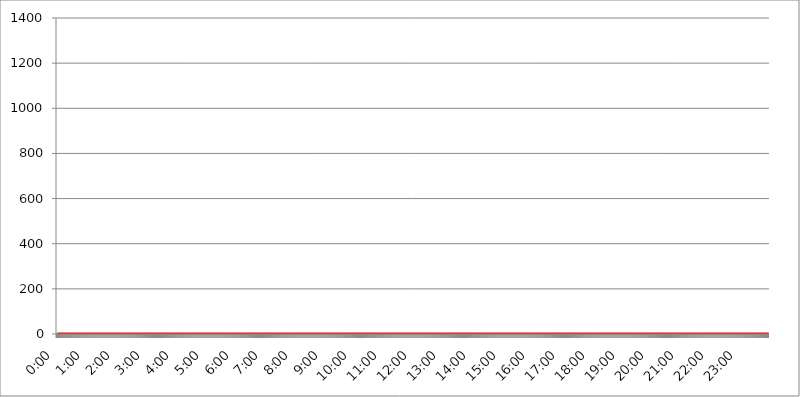
| Category | 2018.04.14. Intenzitás [W/m^2] |
|---|---|
| 0.0 | 0 |
| 0.0006944444444444445 | 0 |
| 0.001388888888888889 | 0 |
| 0.0020833333333333333 | 0 |
| 0.002777777777777778 | 0 |
| 0.003472222222222222 | 0 |
| 0.004166666666666667 | 0 |
| 0.004861111111111111 | 0 |
| 0.005555555555555556 | 0 |
| 0.0062499999999999995 | 0 |
| 0.006944444444444444 | 0 |
| 0.007638888888888889 | 0 |
| 0.008333333333333333 | 0 |
| 0.009027777777777779 | 0 |
| 0.009722222222222222 | 0 |
| 0.010416666666666666 | 0 |
| 0.011111111111111112 | 0 |
| 0.011805555555555555 | 0 |
| 0.012499999999999999 | 0 |
| 0.013194444444444444 | 0 |
| 0.013888888888888888 | 0 |
| 0.014583333333333332 | 0 |
| 0.015277777777777777 | 0 |
| 0.015972222222222224 | 0 |
| 0.016666666666666666 | 0 |
| 0.017361111111111112 | 0 |
| 0.018055555555555557 | 0 |
| 0.01875 | 0 |
| 0.019444444444444445 | 0 |
| 0.02013888888888889 | 0 |
| 0.020833333333333332 | 0 |
| 0.02152777777777778 | 0 |
| 0.022222222222222223 | 0 |
| 0.02291666666666667 | 0 |
| 0.02361111111111111 | 0 |
| 0.024305555555555556 | 0 |
| 0.024999999999999998 | 0 |
| 0.025694444444444447 | 0 |
| 0.02638888888888889 | 0 |
| 0.027083333333333334 | 0 |
| 0.027777777777777776 | 0 |
| 0.02847222222222222 | 0 |
| 0.029166666666666664 | 0 |
| 0.029861111111111113 | 0 |
| 0.030555555555555555 | 0 |
| 0.03125 | 0 |
| 0.03194444444444445 | 0 |
| 0.03263888888888889 | 0 |
| 0.03333333333333333 | 0 |
| 0.034027777777777775 | 0 |
| 0.034722222222222224 | 0 |
| 0.035416666666666666 | 0 |
| 0.036111111111111115 | 0 |
| 0.03680555555555556 | 0 |
| 0.0375 | 0 |
| 0.03819444444444444 | 0 |
| 0.03888888888888889 | 0 |
| 0.03958333333333333 | 0 |
| 0.04027777777777778 | 0 |
| 0.04097222222222222 | 0 |
| 0.041666666666666664 | 0 |
| 0.042361111111111106 | 0 |
| 0.04305555555555556 | 0 |
| 0.043750000000000004 | 0 |
| 0.044444444444444446 | 0 |
| 0.04513888888888889 | 0 |
| 0.04583333333333334 | 0 |
| 0.04652777777777778 | 0 |
| 0.04722222222222222 | 0 |
| 0.04791666666666666 | 0 |
| 0.04861111111111111 | 0 |
| 0.049305555555555554 | 0 |
| 0.049999999999999996 | 0 |
| 0.05069444444444445 | 0 |
| 0.051388888888888894 | 0 |
| 0.052083333333333336 | 0 |
| 0.05277777777777778 | 0 |
| 0.05347222222222222 | 0 |
| 0.05416666666666667 | 0 |
| 0.05486111111111111 | 0 |
| 0.05555555555555555 | 0 |
| 0.05625 | 0 |
| 0.05694444444444444 | 0 |
| 0.057638888888888885 | 0 |
| 0.05833333333333333 | 0 |
| 0.05902777777777778 | 0 |
| 0.059722222222222225 | 0 |
| 0.06041666666666667 | 0 |
| 0.061111111111111116 | 0 |
| 0.06180555555555556 | 0 |
| 0.0625 | 0 |
| 0.06319444444444444 | 0 |
| 0.06388888888888888 | 0 |
| 0.06458333333333334 | 0 |
| 0.06527777777777778 | 0 |
| 0.06597222222222222 | 0 |
| 0.06666666666666667 | 0 |
| 0.06736111111111111 | 0 |
| 0.06805555555555555 | 0 |
| 0.06874999999999999 | 0 |
| 0.06944444444444443 | 0 |
| 0.07013888888888889 | 0 |
| 0.07083333333333333 | 0 |
| 0.07152777777777779 | 0 |
| 0.07222222222222223 | 0 |
| 0.07291666666666667 | 0 |
| 0.07361111111111111 | 0 |
| 0.07430555555555556 | 0 |
| 0.075 | 0 |
| 0.07569444444444444 | 0 |
| 0.0763888888888889 | 0 |
| 0.07708333333333334 | 0 |
| 0.07777777777777778 | 0 |
| 0.07847222222222222 | 0 |
| 0.07916666666666666 | 0 |
| 0.0798611111111111 | 0 |
| 0.08055555555555556 | 0 |
| 0.08125 | 0 |
| 0.08194444444444444 | 0 |
| 0.08263888888888889 | 0 |
| 0.08333333333333333 | 0 |
| 0.08402777777777777 | 0 |
| 0.08472222222222221 | 0 |
| 0.08541666666666665 | 0 |
| 0.08611111111111112 | 0 |
| 0.08680555555555557 | 0 |
| 0.08750000000000001 | 0 |
| 0.08819444444444445 | 0 |
| 0.08888888888888889 | 0 |
| 0.08958333333333333 | 0 |
| 0.09027777777777778 | 0 |
| 0.09097222222222222 | 0 |
| 0.09166666666666667 | 0 |
| 0.09236111111111112 | 0 |
| 0.09305555555555556 | 0 |
| 0.09375 | 0 |
| 0.09444444444444444 | 0 |
| 0.09513888888888888 | 0 |
| 0.09583333333333333 | 0 |
| 0.09652777777777777 | 0 |
| 0.09722222222222222 | 0 |
| 0.09791666666666667 | 0 |
| 0.09861111111111111 | 0 |
| 0.09930555555555555 | 0 |
| 0.09999999999999999 | 0 |
| 0.10069444444444443 | 0 |
| 0.1013888888888889 | 0 |
| 0.10208333333333335 | 0 |
| 0.10277777777777779 | 0 |
| 0.10347222222222223 | 0 |
| 0.10416666666666667 | 0 |
| 0.10486111111111111 | 0 |
| 0.10555555555555556 | 0 |
| 0.10625 | 0 |
| 0.10694444444444444 | 0 |
| 0.1076388888888889 | 0 |
| 0.10833333333333334 | 0 |
| 0.10902777777777778 | 0 |
| 0.10972222222222222 | 0 |
| 0.1111111111111111 | 0 |
| 0.11180555555555556 | 0 |
| 0.11180555555555556 | 0 |
| 0.1125 | 0 |
| 0.11319444444444444 | 0 |
| 0.11388888888888889 | 0 |
| 0.11458333333333333 | 0 |
| 0.11527777777777777 | 0 |
| 0.11597222222222221 | 0 |
| 0.11666666666666665 | 0 |
| 0.1173611111111111 | 0 |
| 0.11805555555555557 | 0 |
| 0.11944444444444445 | 0 |
| 0.12013888888888889 | 0 |
| 0.12083333333333333 | 0 |
| 0.12152777777777778 | 0 |
| 0.12222222222222223 | 0 |
| 0.12291666666666667 | 0 |
| 0.12291666666666667 | 0 |
| 0.12361111111111112 | 0 |
| 0.12430555555555556 | 0 |
| 0.125 | 0 |
| 0.12569444444444444 | 0 |
| 0.12638888888888888 | 0 |
| 0.12708333333333333 | 0 |
| 0.16875 | 0 |
| 0.12847222222222224 | 0 |
| 0.12916666666666668 | 0 |
| 0.12986111111111112 | 0 |
| 0.13055555555555556 | 0 |
| 0.13125 | 0 |
| 0.13194444444444445 | 0 |
| 0.1326388888888889 | 0 |
| 0.13333333333333333 | 0 |
| 0.13402777777777777 | 0 |
| 0.13402777777777777 | 0 |
| 0.13472222222222222 | 0 |
| 0.13541666666666666 | 0 |
| 0.1361111111111111 | 0 |
| 0.13749999999999998 | 0 |
| 0.13819444444444443 | 0 |
| 0.1388888888888889 | 0 |
| 0.13958333333333334 | 0 |
| 0.14027777777777778 | 0 |
| 0.14097222222222222 | 0 |
| 0.14166666666666666 | 0 |
| 0.1423611111111111 | 0 |
| 0.14305555555555557 | 0 |
| 0.14375000000000002 | 0 |
| 0.14444444444444446 | 0 |
| 0.1451388888888889 | 0 |
| 0.1451388888888889 | 0 |
| 0.14652777777777778 | 0 |
| 0.14722222222222223 | 0 |
| 0.14791666666666667 | 0 |
| 0.1486111111111111 | 0 |
| 0.14930555555555555 | 0 |
| 0.15 | 0 |
| 0.15069444444444444 | 0 |
| 0.15138888888888888 | 0 |
| 0.15208333333333332 | 0 |
| 0.15277777777777776 | 0 |
| 0.15347222222222223 | 0 |
| 0.15416666666666667 | 0 |
| 0.15486111111111112 | 0 |
| 0.15555555555555556 | 0 |
| 0.15625 | 0 |
| 0.15694444444444444 | 0 |
| 0.15763888888888888 | 0 |
| 0.15833333333333333 | 0 |
| 0.15902777777777777 | 0 |
| 0.15972222222222224 | 0 |
| 0.16041666666666668 | 0 |
| 0.16111111111111112 | 0 |
| 0.16180555555555556 | 0 |
| 0.1625 | 0 |
| 0.16319444444444445 | 0 |
| 0.1638888888888889 | 0 |
| 0.16458333333333333 | 0 |
| 0.16527777777777777 | 0 |
| 0.16597222222222222 | 0 |
| 0.16666666666666666 | 0 |
| 0.1673611111111111 | 0 |
| 0.16805555555555554 | 0 |
| 0.16874999999999998 | 0 |
| 0.16944444444444443 | 0 |
| 0.17013888888888887 | 0 |
| 0.1708333333333333 | 0 |
| 0.17152777777777775 | 0 |
| 0.17222222222222225 | 0 |
| 0.1729166666666667 | 0 |
| 0.17361111111111113 | 0 |
| 0.17430555555555557 | 0 |
| 0.17500000000000002 | 0 |
| 0.17569444444444446 | 0 |
| 0.1763888888888889 | 0 |
| 0.17708333333333334 | 0 |
| 0.17777777777777778 | 0 |
| 0.17847222222222223 | 0 |
| 0.17916666666666667 | 0 |
| 0.1798611111111111 | 0 |
| 0.18055555555555555 | 0 |
| 0.18125 | 0 |
| 0.18194444444444444 | 0 |
| 0.1826388888888889 | 0 |
| 0.18333333333333335 | 0 |
| 0.1840277777777778 | 0 |
| 0.18472222222222223 | 0 |
| 0.18541666666666667 | 0 |
| 0.18611111111111112 | 0 |
| 0.18680555555555556 | 0 |
| 0.1875 | 0 |
| 0.18819444444444444 | 0 |
| 0.18888888888888888 | 0 |
| 0.18958333333333333 | 0 |
| 0.19027777777777777 | 0 |
| 0.1909722222222222 | 0 |
| 0.19166666666666665 | 0 |
| 0.19236111111111112 | 0 |
| 0.19305555555555554 | 0 |
| 0.19375 | 0 |
| 0.19444444444444445 | 0 |
| 0.1951388888888889 | 0 |
| 0.19583333333333333 | 0 |
| 0.19652777777777777 | 0 |
| 0.19722222222222222 | 0 |
| 0.19791666666666666 | 0 |
| 0.1986111111111111 | 0 |
| 0.19930555555555554 | 0 |
| 0.19999999999999998 | 0 |
| 0.20069444444444443 | 0 |
| 0.20138888888888887 | 0 |
| 0.2020833333333333 | 0 |
| 0.2027777777777778 | 0 |
| 0.2034722222222222 | 0 |
| 0.2041666666666667 | 0 |
| 0.20486111111111113 | 0 |
| 0.20555555555555557 | 0 |
| 0.20625000000000002 | 0 |
| 0.20694444444444446 | 0 |
| 0.2076388888888889 | 0 |
| 0.20833333333333334 | 0 |
| 0.20902777777777778 | 0 |
| 0.20972222222222223 | 0 |
| 0.21041666666666667 | 0 |
| 0.2111111111111111 | 0 |
| 0.21180555555555555 | 0 |
| 0.2125 | 0 |
| 0.21319444444444444 | 0 |
| 0.2138888888888889 | 0 |
| 0.21458333333333335 | 0 |
| 0.2152777777777778 | 0 |
| 0.21597222222222223 | 0 |
| 0.21666666666666667 | 0 |
| 0.21736111111111112 | 0 |
| 0.21805555555555556 | 0 |
| 0.21875 | 0 |
| 0.21944444444444444 | 0 |
| 0.22013888888888888 | 0 |
| 0.22083333333333333 | 0 |
| 0.22152777777777777 | 0 |
| 0.2222222222222222 | 0 |
| 0.22291666666666665 | 0 |
| 0.2236111111111111 | 0 |
| 0.22430555555555556 | 0 |
| 0.225 | 0 |
| 0.22569444444444445 | 0 |
| 0.2263888888888889 | 0 |
| 0.22708333333333333 | 0 |
| 0.22777777777777777 | 0 |
| 0.22847222222222222 | 0 |
| 0.22916666666666666 | 0 |
| 0.2298611111111111 | 0 |
| 0.23055555555555554 | 0 |
| 0.23124999999999998 | 0 |
| 0.23194444444444443 | 0 |
| 0.23263888888888887 | 0 |
| 0.2333333333333333 | 0 |
| 0.2340277777777778 | 0 |
| 0.2347222222222222 | 0 |
| 0.2354166666666667 | 0 |
| 0.23611111111111113 | 0 |
| 0.23680555555555557 | 0 |
| 0.23750000000000002 | 0 |
| 0.23819444444444446 | 0 |
| 0.2388888888888889 | 0 |
| 0.23958333333333334 | 0 |
| 0.24027777777777778 | 0 |
| 0.24097222222222223 | 0 |
| 0.24166666666666667 | 0 |
| 0.2423611111111111 | 0 |
| 0.24305555555555555 | 0 |
| 0.24375 | 0 |
| 0.24444444444444446 | 0 |
| 0.24513888888888888 | 0 |
| 0.24583333333333335 | 0 |
| 0.2465277777777778 | 0 |
| 0.24722222222222223 | 0 |
| 0.24791666666666667 | 0 |
| 0.24861111111111112 | 0 |
| 0.24930555555555556 | 0 |
| 0.25 | 0 |
| 0.25069444444444444 | 0 |
| 0.2513888888888889 | 0 |
| 0.2520833333333333 | 0 |
| 0.25277777777777777 | 0 |
| 0.2534722222222222 | 0 |
| 0.25416666666666665 | 0 |
| 0.2548611111111111 | 0 |
| 0.2555555555555556 | 0 |
| 0.25625000000000003 | 0 |
| 0.2569444444444445 | 0 |
| 0.2576388888888889 | 0 |
| 0.25833333333333336 | 0 |
| 0.2590277777777778 | 0 |
| 0.25972222222222224 | 0 |
| 0.2604166666666667 | 0 |
| 0.2611111111111111 | 0 |
| 0.26180555555555557 | 0 |
| 0.2625 | 0 |
| 0.26319444444444445 | 0 |
| 0.2638888888888889 | 0 |
| 0.26458333333333334 | 0 |
| 0.2652777777777778 | 0 |
| 0.2659722222222222 | 0 |
| 0.26666666666666666 | 0 |
| 0.2673611111111111 | 0 |
| 0.26805555555555555 | 0 |
| 0.26875 | 0 |
| 0.26944444444444443 | 0 |
| 0.2701388888888889 | 0 |
| 0.2708333333333333 | 0 |
| 0.27152777777777776 | 0 |
| 0.2722222222222222 | 0 |
| 0.27291666666666664 | 0 |
| 0.2736111111111111 | 0 |
| 0.2743055555555555 | 0 |
| 0.27499999999999997 | 0 |
| 0.27569444444444446 | 0 |
| 0.27638888888888885 | 0 |
| 0.27708333333333335 | 0 |
| 0.2777777777777778 | 0 |
| 0.27847222222222223 | 0 |
| 0.2791666666666667 | 0 |
| 0.2798611111111111 | 0 |
| 0.28055555555555556 | 0 |
| 0.28125 | 0 |
| 0.28194444444444444 | 0 |
| 0.2826388888888889 | 0 |
| 0.2833333333333333 | 0 |
| 0.28402777777777777 | 0 |
| 0.2847222222222222 | 0 |
| 0.28541666666666665 | 0 |
| 0.28611111111111115 | 0 |
| 0.28680555555555554 | 0 |
| 0.28750000000000003 | 0 |
| 0.2881944444444445 | 0 |
| 0.2888888888888889 | 0 |
| 0.28958333333333336 | 0 |
| 0.2902777777777778 | 0 |
| 0.29097222222222224 | 0 |
| 0.2916666666666667 | 0 |
| 0.2923611111111111 | 0 |
| 0.29305555555555557 | 0 |
| 0.29375 | 0 |
| 0.29444444444444445 | 0 |
| 0.2951388888888889 | 0 |
| 0.29583333333333334 | 0 |
| 0.2965277777777778 | 0 |
| 0.2972222222222222 | 0 |
| 0.29791666666666666 | 0 |
| 0.2986111111111111 | 0 |
| 0.29930555555555555 | 0 |
| 0.3 | 0 |
| 0.30069444444444443 | 0 |
| 0.3013888888888889 | 0 |
| 0.3020833333333333 | 0 |
| 0.30277777777777776 | 0 |
| 0.3034722222222222 | 0 |
| 0.30416666666666664 | 0 |
| 0.3048611111111111 | 0 |
| 0.3055555555555555 | 0 |
| 0.30624999999999997 | 0 |
| 0.3069444444444444 | 0 |
| 0.3076388888888889 | 0 |
| 0.30833333333333335 | 0 |
| 0.3090277777777778 | 0 |
| 0.30972222222222223 | 0 |
| 0.3104166666666667 | 0 |
| 0.3111111111111111 | 0 |
| 0.31180555555555556 | 0 |
| 0.3125 | 0 |
| 0.31319444444444444 | 0 |
| 0.3138888888888889 | 0 |
| 0.3145833333333333 | 0 |
| 0.31527777777777777 | 0 |
| 0.3159722222222222 | 0 |
| 0.31666666666666665 | 0 |
| 0.31736111111111115 | 0 |
| 0.31805555555555554 | 0 |
| 0.31875000000000003 | 0 |
| 0.3194444444444445 | 0 |
| 0.3201388888888889 | 0 |
| 0.32083333333333336 | 0 |
| 0.3215277777777778 | 0 |
| 0.32222222222222224 | 0 |
| 0.3229166666666667 | 0 |
| 0.3236111111111111 | 0 |
| 0.32430555555555557 | 0 |
| 0.325 | 0 |
| 0.32569444444444445 | 0 |
| 0.3263888888888889 | 0 |
| 0.32708333333333334 | 0 |
| 0.3277777777777778 | 0 |
| 0.3284722222222222 | 0 |
| 0.32916666666666666 | 0 |
| 0.3298611111111111 | 0 |
| 0.33055555555555555 | 0 |
| 0.33125 | 0 |
| 0.33194444444444443 | 0 |
| 0.3326388888888889 | 0 |
| 0.3333333333333333 | 0 |
| 0.3340277777777778 | 0 |
| 0.3347222222222222 | 0 |
| 0.3354166666666667 | 0 |
| 0.3361111111111111 | 0 |
| 0.3368055555555556 | 0 |
| 0.33749999999999997 | 0 |
| 0.33819444444444446 | 0 |
| 0.33888888888888885 | 0 |
| 0.33958333333333335 | 0 |
| 0.34027777777777773 | 0 |
| 0.34097222222222223 | 0 |
| 0.3416666666666666 | 0 |
| 0.3423611111111111 | 0 |
| 0.3430555555555555 | 0 |
| 0.34375 | 0 |
| 0.3444444444444445 | 0 |
| 0.3451388888888889 | 0 |
| 0.3458333333333334 | 0 |
| 0.34652777777777777 | 0 |
| 0.34722222222222227 | 0 |
| 0.34791666666666665 | 0 |
| 0.34861111111111115 | 0 |
| 0.34930555555555554 | 0 |
| 0.35000000000000003 | 0 |
| 0.3506944444444444 | 0 |
| 0.3513888888888889 | 0 |
| 0.3520833333333333 | 0 |
| 0.3527777777777778 | 0 |
| 0.3534722222222222 | 0 |
| 0.3541666666666667 | 0 |
| 0.3548611111111111 | 0 |
| 0.35555555555555557 | 0 |
| 0.35625 | 0 |
| 0.35694444444444445 | 0 |
| 0.3576388888888889 | 0 |
| 0.35833333333333334 | 0 |
| 0.3590277777777778 | 0 |
| 0.3597222222222222 | 0 |
| 0.36041666666666666 | 0 |
| 0.3611111111111111 | 0 |
| 0.36180555555555555 | 0 |
| 0.3625 | 0 |
| 0.36319444444444443 | 0 |
| 0.3638888888888889 | 0 |
| 0.3645833333333333 | 0 |
| 0.3652777777777778 | 0 |
| 0.3659722222222222 | 0 |
| 0.3666666666666667 | 0 |
| 0.3673611111111111 | 0 |
| 0.3680555555555556 | 0 |
| 0.36874999999999997 | 0 |
| 0.36944444444444446 | 0 |
| 0.37013888888888885 | 0 |
| 0.37083333333333335 | 0 |
| 0.37152777777777773 | 0 |
| 0.37222222222222223 | 0 |
| 0.3729166666666666 | 0 |
| 0.3736111111111111 | 0 |
| 0.3743055555555555 | 0 |
| 0.375 | 0 |
| 0.3756944444444445 | 0 |
| 0.3763888888888889 | 0 |
| 0.3770833333333334 | 0 |
| 0.37777777777777777 | 0 |
| 0.37847222222222227 | 0 |
| 0.37916666666666665 | 0 |
| 0.37986111111111115 | 0 |
| 0.38055555555555554 | 0 |
| 0.38125000000000003 | 0 |
| 0.3819444444444444 | 0 |
| 0.3826388888888889 | 0 |
| 0.3833333333333333 | 0 |
| 0.3840277777777778 | 0 |
| 0.3847222222222222 | 0 |
| 0.3854166666666667 | 0 |
| 0.3861111111111111 | 0 |
| 0.38680555555555557 | 0 |
| 0.3875 | 0 |
| 0.38819444444444445 | 0 |
| 0.3888888888888889 | 0 |
| 0.38958333333333334 | 0 |
| 0.3902777777777778 | 0 |
| 0.3909722222222222 | 0 |
| 0.39166666666666666 | 0 |
| 0.3923611111111111 | 0 |
| 0.39305555555555555 | 0 |
| 0.39375 | 0 |
| 0.39444444444444443 | 0 |
| 0.3951388888888889 | 0 |
| 0.3958333333333333 | 0 |
| 0.3965277777777778 | 0 |
| 0.3972222222222222 | 0 |
| 0.3979166666666667 | 0 |
| 0.3986111111111111 | 0 |
| 0.3993055555555556 | 0 |
| 0.39999999999999997 | 0 |
| 0.40069444444444446 | 0 |
| 0.40138888888888885 | 0 |
| 0.40208333333333335 | 0 |
| 0.40277777777777773 | 0 |
| 0.40347222222222223 | 0 |
| 0.4041666666666666 | 0 |
| 0.4048611111111111 | 0 |
| 0.4055555555555555 | 0 |
| 0.40625 | 0 |
| 0.4069444444444445 | 0 |
| 0.4076388888888889 | 0 |
| 0.4083333333333334 | 0 |
| 0.40902777777777777 | 0 |
| 0.40972222222222227 | 0 |
| 0.41041666666666665 | 0 |
| 0.41111111111111115 | 0 |
| 0.41180555555555554 | 0 |
| 0.41250000000000003 | 0 |
| 0.4131944444444444 | 0 |
| 0.4138888888888889 | 0 |
| 0.4145833333333333 | 0 |
| 0.4152777777777778 | 0 |
| 0.4159722222222222 | 0 |
| 0.4166666666666667 | 0 |
| 0.4173611111111111 | 0 |
| 0.41805555555555557 | 0 |
| 0.41875 | 0 |
| 0.41944444444444445 | 0 |
| 0.4201388888888889 | 0 |
| 0.42083333333333334 | 0 |
| 0.4215277777777778 | 0 |
| 0.4222222222222222 | 0 |
| 0.42291666666666666 | 0 |
| 0.4236111111111111 | 0 |
| 0.42430555555555555 | 0 |
| 0.425 | 0 |
| 0.42569444444444443 | 0 |
| 0.4263888888888889 | 0 |
| 0.4270833333333333 | 0 |
| 0.4277777777777778 | 0 |
| 0.4284722222222222 | 0 |
| 0.4291666666666667 | 0 |
| 0.4298611111111111 | 0 |
| 0.4305555555555556 | 0 |
| 0.43124999999999997 | 0 |
| 0.43194444444444446 | 0 |
| 0.43263888888888885 | 0 |
| 0.43333333333333335 | 0 |
| 0.43402777777777773 | 0 |
| 0.43472222222222223 | 0 |
| 0.4354166666666666 | 0 |
| 0.4361111111111111 | 0 |
| 0.4368055555555555 | 0 |
| 0.4375 | 0 |
| 0.4381944444444445 | 0 |
| 0.4388888888888889 | 0 |
| 0.4395833333333334 | 0 |
| 0.44027777777777777 | 0 |
| 0.44097222222222227 | 0 |
| 0.44166666666666665 | 0 |
| 0.44236111111111115 | 0 |
| 0.44305555555555554 | 0 |
| 0.44375000000000003 | 0 |
| 0.4444444444444444 | 0 |
| 0.4451388888888889 | 0 |
| 0.4458333333333333 | 0 |
| 0.4465277777777778 | 0 |
| 0.4472222222222222 | 0 |
| 0.4479166666666667 | 0 |
| 0.4486111111111111 | 0 |
| 0.44930555555555557 | 0 |
| 0.45 | 0 |
| 0.45069444444444445 | 0 |
| 0.4513888888888889 | 0 |
| 0.45208333333333334 | 0 |
| 0.4527777777777778 | 0 |
| 0.4534722222222222 | 0 |
| 0.45416666666666666 | 0 |
| 0.4548611111111111 | 0 |
| 0.45555555555555555 | 0 |
| 0.45625 | 0 |
| 0.45694444444444443 | 0 |
| 0.4576388888888889 | 0 |
| 0.4583333333333333 | 0 |
| 0.4590277777777778 | 0 |
| 0.4597222222222222 | 0 |
| 0.4604166666666667 | 0 |
| 0.4611111111111111 | 0 |
| 0.4618055555555556 | 0 |
| 0.46249999999999997 | 0 |
| 0.46319444444444446 | 0 |
| 0.46388888888888885 | 0 |
| 0.46458333333333335 | 0 |
| 0.46527777777777773 | 0 |
| 0.46597222222222223 | 0 |
| 0.4666666666666666 | 0 |
| 0.4673611111111111 | 0 |
| 0.4680555555555555 | 0 |
| 0.46875 | 0 |
| 0.4694444444444445 | 0 |
| 0.4701388888888889 | 0 |
| 0.4708333333333334 | 0 |
| 0.47152777777777777 | 0 |
| 0.47222222222222227 | 0 |
| 0.47291666666666665 | 0 |
| 0.47361111111111115 | 0 |
| 0.47430555555555554 | 0 |
| 0.47500000000000003 | 0 |
| 0.4756944444444444 | 0 |
| 0.4763888888888889 | 0 |
| 0.4770833333333333 | 0 |
| 0.4777777777777778 | 0 |
| 0.4784722222222222 | 0 |
| 0.4791666666666667 | 0 |
| 0.4798611111111111 | 0 |
| 0.48055555555555557 | 0 |
| 0.48125 | 0 |
| 0.48194444444444445 | 0 |
| 0.4826388888888889 | 0 |
| 0.48333333333333334 | 0 |
| 0.4840277777777778 | 0 |
| 0.4847222222222222 | 0 |
| 0.48541666666666666 | 0 |
| 0.4861111111111111 | 0 |
| 0.48680555555555555 | 0 |
| 0.4875 | 0 |
| 0.48819444444444443 | 0 |
| 0.4888888888888889 | 0 |
| 0.4895833333333333 | 0 |
| 0.4902777777777778 | 0 |
| 0.4909722222222222 | 0 |
| 0.4916666666666667 | 0 |
| 0.4923611111111111 | 0 |
| 0.4930555555555556 | 0 |
| 0.49374999999999997 | 0 |
| 0.49444444444444446 | 0 |
| 0.49513888888888885 | 0 |
| 0.49583333333333335 | 0 |
| 0.49652777777777773 | 0 |
| 0.49722222222222223 | 0 |
| 0.4979166666666666 | 0 |
| 0.4986111111111111 | 0 |
| 0.4993055555555555 | 0 |
| 0.5 | 0 |
| 0.5006944444444444 | 0 |
| 0.5013888888888889 | 0 |
| 0.5020833333333333 | 0 |
| 0.5027777777777778 | 0 |
| 0.5034722222222222 | 0 |
| 0.5041666666666667 | 0 |
| 0.5048611111111111 | 0 |
| 0.5055555555555555 | 0 |
| 0.50625 | 0 |
| 0.5069444444444444 | 0 |
| 0.5076388888888889 | 0 |
| 0.5083333333333333 | 0 |
| 0.5090277777777777 | 0 |
| 0.5097222222222222 | 0 |
| 0.5104166666666666 | 0 |
| 0.5111111111111112 | 0 |
| 0.5118055555555555 | 0 |
| 0.5125000000000001 | 0 |
| 0.5131944444444444 | 0 |
| 0.513888888888889 | 0 |
| 0.5145833333333333 | 0 |
| 0.5152777777777778 | 0 |
| 0.5159722222222222 | 0 |
| 0.5166666666666667 | 0 |
| 0.517361111111111 | 0 |
| 0.5180555555555556 | 0 |
| 0.5187499999999999 | 0 |
| 0.5194444444444445 | 0 |
| 0.5201388888888888 | 0 |
| 0.5208333333333334 | 0 |
| 0.5215277777777778 | 0 |
| 0.5222222222222223 | 0 |
| 0.5229166666666667 | 0 |
| 0.5236111111111111 | 0 |
| 0.5243055555555556 | 0 |
| 0.525 | 0 |
| 0.5256944444444445 | 0 |
| 0.5263888888888889 | 0 |
| 0.5270833333333333 | 0 |
| 0.5277777777777778 | 0 |
| 0.5284722222222222 | 0 |
| 0.5291666666666667 | 0 |
| 0.5298611111111111 | 0 |
| 0.5305555555555556 | 0 |
| 0.53125 | 0 |
| 0.5319444444444444 | 0 |
| 0.5326388888888889 | 0 |
| 0.5333333333333333 | 0 |
| 0.5340277777777778 | 0 |
| 0.5347222222222222 | 0 |
| 0.5354166666666667 | 0 |
| 0.5361111111111111 | 0 |
| 0.5368055555555555 | 0 |
| 0.5375 | 0 |
| 0.5381944444444444 | 0 |
| 0.5388888888888889 | 0 |
| 0.5395833333333333 | 0 |
| 0.5402777777777777 | 0 |
| 0.5409722222222222 | 0 |
| 0.5416666666666666 | 0 |
| 0.5423611111111112 | 0 |
| 0.5430555555555555 | 0 |
| 0.5437500000000001 | 0 |
| 0.5444444444444444 | 0 |
| 0.545138888888889 | 0 |
| 0.5458333333333333 | 0 |
| 0.5465277777777778 | 0 |
| 0.5472222222222222 | 0 |
| 0.5479166666666667 | 0 |
| 0.548611111111111 | 0 |
| 0.5493055555555556 | 0 |
| 0.5499999999999999 | 0 |
| 0.5506944444444445 | 0 |
| 0.5513888888888888 | 0 |
| 0.5520833333333334 | 0 |
| 0.5527777777777778 | 0 |
| 0.5534722222222223 | 0 |
| 0.5541666666666667 | 0 |
| 0.5548611111111111 | 0 |
| 0.5555555555555556 | 0 |
| 0.55625 | 0 |
| 0.5569444444444445 | 0 |
| 0.5576388888888889 | 0 |
| 0.5583333333333333 | 0 |
| 0.5590277777777778 | 0 |
| 0.5597222222222222 | 0 |
| 0.5604166666666667 | 0 |
| 0.5611111111111111 | 0 |
| 0.5618055555555556 | 0 |
| 0.5625 | 0 |
| 0.5631944444444444 | 0 |
| 0.5638888888888889 | 0 |
| 0.5645833333333333 | 0 |
| 0.5652777777777778 | 0 |
| 0.5659722222222222 | 0 |
| 0.5666666666666667 | 0 |
| 0.5673611111111111 | 0 |
| 0.5680555555555555 | 0 |
| 0.56875 | 0 |
| 0.5694444444444444 | 0 |
| 0.5701388888888889 | 0 |
| 0.5708333333333333 | 0 |
| 0.5715277777777777 | 0 |
| 0.5722222222222222 | 0 |
| 0.5729166666666666 | 0 |
| 0.5736111111111112 | 0 |
| 0.5743055555555555 | 0 |
| 0.5750000000000001 | 0 |
| 0.5756944444444444 | 0 |
| 0.576388888888889 | 0 |
| 0.5770833333333333 | 0 |
| 0.5777777777777778 | 0 |
| 0.5784722222222222 | 0 |
| 0.5791666666666667 | 0 |
| 0.579861111111111 | 0 |
| 0.5805555555555556 | 0 |
| 0.5812499999999999 | 0 |
| 0.5819444444444445 | 0 |
| 0.5826388888888888 | 0 |
| 0.5833333333333334 | 0 |
| 0.5840277777777778 | 0 |
| 0.5847222222222223 | 0 |
| 0.5854166666666667 | 0 |
| 0.5861111111111111 | 0 |
| 0.5868055555555556 | 0 |
| 0.5875 | 0 |
| 0.5881944444444445 | 0 |
| 0.5888888888888889 | 0 |
| 0.5895833333333333 | 0 |
| 0.5902777777777778 | 0 |
| 0.5909722222222222 | 0 |
| 0.5916666666666667 | 0 |
| 0.5923611111111111 | 0 |
| 0.5930555555555556 | 0 |
| 0.59375 | 0 |
| 0.5944444444444444 | 0 |
| 0.5951388888888889 | 0 |
| 0.5958333333333333 | 0 |
| 0.5965277777777778 | 0 |
| 0.5972222222222222 | 0 |
| 0.5979166666666667 | 0 |
| 0.5986111111111111 | 0 |
| 0.5993055555555555 | 0 |
| 0.6 | 0 |
| 0.6006944444444444 | 0 |
| 0.6013888888888889 | 0 |
| 0.6020833333333333 | 0 |
| 0.6027777777777777 | 0 |
| 0.6034722222222222 | 0 |
| 0.6041666666666666 | 0 |
| 0.6048611111111112 | 0 |
| 0.6055555555555555 | 0 |
| 0.6062500000000001 | 0 |
| 0.6069444444444444 | 0 |
| 0.607638888888889 | 0 |
| 0.6083333333333333 | 0 |
| 0.6090277777777778 | 0 |
| 0.6097222222222222 | 0 |
| 0.6104166666666667 | 0 |
| 0.611111111111111 | 0 |
| 0.6118055555555556 | 0 |
| 0.6124999999999999 | 0 |
| 0.6131944444444445 | 0 |
| 0.6138888888888888 | 0 |
| 0.6145833333333334 | 0 |
| 0.6152777777777778 | 0 |
| 0.6159722222222223 | 0 |
| 0.6166666666666667 | 0 |
| 0.6173611111111111 | 0 |
| 0.6180555555555556 | 0 |
| 0.61875 | 0 |
| 0.6194444444444445 | 0 |
| 0.6201388888888889 | 0 |
| 0.6208333333333333 | 0 |
| 0.6215277777777778 | 0 |
| 0.6222222222222222 | 0 |
| 0.6229166666666667 | 0 |
| 0.6236111111111111 | 0 |
| 0.6243055555555556 | 0 |
| 0.625 | 0 |
| 0.6256944444444444 | 0 |
| 0.6263888888888889 | 0 |
| 0.6270833333333333 | 0 |
| 0.6277777777777778 | 0 |
| 0.6284722222222222 | 0 |
| 0.6291666666666667 | 0 |
| 0.6298611111111111 | 0 |
| 0.6305555555555555 | 0 |
| 0.63125 | 0 |
| 0.6319444444444444 | 0 |
| 0.6326388888888889 | 0 |
| 0.6333333333333333 | 0 |
| 0.6340277777777777 | 0 |
| 0.6347222222222222 | 0 |
| 0.6354166666666666 | 0 |
| 0.6361111111111112 | 0 |
| 0.6368055555555555 | 0 |
| 0.6375000000000001 | 0 |
| 0.6381944444444444 | 0 |
| 0.638888888888889 | 0 |
| 0.6395833333333333 | 0 |
| 0.6402777777777778 | 0 |
| 0.6409722222222222 | 0 |
| 0.6416666666666667 | 0 |
| 0.642361111111111 | 0 |
| 0.6430555555555556 | 0 |
| 0.6437499999999999 | 0 |
| 0.6444444444444445 | 0 |
| 0.6451388888888888 | 0 |
| 0.6458333333333334 | 0 |
| 0.6465277777777778 | 0 |
| 0.6472222222222223 | 0 |
| 0.6479166666666667 | 0 |
| 0.6486111111111111 | 0 |
| 0.6493055555555556 | 0 |
| 0.65 | 0 |
| 0.6506944444444445 | 0 |
| 0.6513888888888889 | 0 |
| 0.6520833333333333 | 0 |
| 0.6527777777777778 | 0 |
| 0.6534722222222222 | 0 |
| 0.6541666666666667 | 0 |
| 0.6548611111111111 | 0 |
| 0.6555555555555556 | 0 |
| 0.65625 | 0 |
| 0.6569444444444444 | 0 |
| 0.6576388888888889 | 0 |
| 0.6583333333333333 | 0 |
| 0.6590277777777778 | 0 |
| 0.6597222222222222 | 0 |
| 0.6604166666666667 | 0 |
| 0.6611111111111111 | 0 |
| 0.6618055555555555 | 0 |
| 0.6625 | 0 |
| 0.6631944444444444 | 0 |
| 0.6638888888888889 | 0 |
| 0.6645833333333333 | 0 |
| 0.6652777777777777 | 0 |
| 0.6659722222222222 | 0 |
| 0.6666666666666666 | 0 |
| 0.6673611111111111 | 0 |
| 0.6680555555555556 | 0 |
| 0.6687500000000001 | 0 |
| 0.6694444444444444 | 0 |
| 0.6701388888888888 | 0 |
| 0.6708333333333334 | 0 |
| 0.6715277777777778 | 0 |
| 0.6722222222222222 | 0 |
| 0.6729166666666666 | 0 |
| 0.6736111111111112 | 0 |
| 0.6743055555555556 | 0 |
| 0.6749999999999999 | 0 |
| 0.6756944444444444 | 0 |
| 0.6763888888888889 | 0 |
| 0.6770833333333334 | 0 |
| 0.6777777777777777 | 0 |
| 0.6784722222222223 | 0 |
| 0.6791666666666667 | 0 |
| 0.6798611111111111 | 0 |
| 0.6805555555555555 | 0 |
| 0.68125 | 0 |
| 0.6819444444444445 | 0 |
| 0.6826388888888889 | 0 |
| 0.6833333333333332 | 0 |
| 0.6840277777777778 | 0 |
| 0.6847222222222222 | 0 |
| 0.6854166666666667 | 0 |
| 0.686111111111111 | 0 |
| 0.6868055555555556 | 0 |
| 0.6875 | 0 |
| 0.6881944444444444 | 0 |
| 0.688888888888889 | 0 |
| 0.6895833333333333 | 0 |
| 0.6902777777777778 | 0 |
| 0.6909722222222222 | 0 |
| 0.6916666666666668 | 0 |
| 0.6923611111111111 | 0 |
| 0.6930555555555555 | 0 |
| 0.69375 | 0 |
| 0.6944444444444445 | 0 |
| 0.6951388888888889 | 0 |
| 0.6958333333333333 | 0 |
| 0.6965277777777777 | 0 |
| 0.6972222222222223 | 0 |
| 0.6979166666666666 | 0 |
| 0.6986111111111111 | 0 |
| 0.6993055555555556 | 0 |
| 0.7000000000000001 | 0 |
| 0.7006944444444444 | 0 |
| 0.7013888888888888 | 0 |
| 0.7020833333333334 | 0 |
| 0.7027777777777778 | 0 |
| 0.7034722222222222 | 0 |
| 0.7041666666666666 | 0 |
| 0.7048611111111112 | 0 |
| 0.7055555555555556 | 0 |
| 0.7062499999999999 | 0 |
| 0.7069444444444444 | 0 |
| 0.7076388888888889 | 0 |
| 0.7083333333333334 | 0 |
| 0.7090277777777777 | 0 |
| 0.7097222222222223 | 0 |
| 0.7104166666666667 | 0 |
| 0.7111111111111111 | 0 |
| 0.7118055555555555 | 0 |
| 0.7125 | 0 |
| 0.7131944444444445 | 0 |
| 0.7138888888888889 | 0 |
| 0.7145833333333332 | 0 |
| 0.7152777777777778 | 0 |
| 0.7159722222222222 | 0 |
| 0.7166666666666667 | 0 |
| 0.717361111111111 | 0 |
| 0.7180555555555556 | 0 |
| 0.71875 | 0 |
| 0.7194444444444444 | 0 |
| 0.720138888888889 | 0 |
| 0.7208333333333333 | 0 |
| 0.7215277777777778 | 0 |
| 0.7222222222222222 | 0 |
| 0.7229166666666668 | 0 |
| 0.7236111111111111 | 0 |
| 0.7243055555555555 | 0 |
| 0.725 | 0 |
| 0.7256944444444445 | 0 |
| 0.7263888888888889 | 0 |
| 0.7270833333333333 | 0 |
| 0.7277777777777777 | 0 |
| 0.7284722222222223 | 0 |
| 0.7291666666666666 | 0 |
| 0.7298611111111111 | 0 |
| 0.7305555555555556 | 0 |
| 0.7312500000000001 | 0 |
| 0.7319444444444444 | 0 |
| 0.7326388888888888 | 0 |
| 0.7333333333333334 | 0 |
| 0.7340277777777778 | 0 |
| 0.7347222222222222 | 0 |
| 0.7354166666666666 | 0 |
| 0.7361111111111112 | 0 |
| 0.7368055555555556 | 0 |
| 0.7374999999999999 | 0 |
| 0.7381944444444444 | 0 |
| 0.7388888888888889 | 0 |
| 0.7395833333333334 | 0 |
| 0.7402777777777777 | 0 |
| 0.7409722222222223 | 0 |
| 0.7416666666666667 | 0 |
| 0.7423611111111111 | 0 |
| 0.7430555555555555 | 0 |
| 0.74375 | 0 |
| 0.7444444444444445 | 0 |
| 0.7451388888888889 | 0 |
| 0.7458333333333332 | 0 |
| 0.7465277777777778 | 0 |
| 0.7472222222222222 | 0 |
| 0.7479166666666667 | 0 |
| 0.748611111111111 | 0 |
| 0.7493055555555556 | 0 |
| 0.75 | 0 |
| 0.7506944444444444 | 0 |
| 0.751388888888889 | 0 |
| 0.7520833333333333 | 0 |
| 0.7527777777777778 | 0 |
| 0.7534722222222222 | 0 |
| 0.7541666666666668 | 0 |
| 0.7548611111111111 | 0 |
| 0.7555555555555555 | 0 |
| 0.75625 | 0 |
| 0.7569444444444445 | 0 |
| 0.7576388888888889 | 0 |
| 0.7583333333333333 | 0 |
| 0.7590277777777777 | 0 |
| 0.7597222222222223 | 0 |
| 0.7604166666666666 | 0 |
| 0.7611111111111111 | 0 |
| 0.7618055555555556 | 0 |
| 0.7625000000000001 | 0 |
| 0.7631944444444444 | 0 |
| 0.7638888888888888 | 0 |
| 0.7645833333333334 | 0 |
| 0.7652777777777778 | 0 |
| 0.7659722222222222 | 0 |
| 0.7666666666666666 | 0 |
| 0.7673611111111112 | 0 |
| 0.7680555555555556 | 0 |
| 0.7687499999999999 | 0 |
| 0.7694444444444444 | 0 |
| 0.7701388888888889 | 0 |
| 0.7708333333333334 | 0 |
| 0.7715277777777777 | 0 |
| 0.7722222222222223 | 0 |
| 0.7729166666666667 | 0 |
| 0.7736111111111111 | 0 |
| 0.7743055555555555 | 0 |
| 0.775 | 0 |
| 0.7756944444444445 | 0 |
| 0.7763888888888889 | 0 |
| 0.7770833333333332 | 0 |
| 0.7777777777777778 | 0 |
| 0.7784722222222222 | 0 |
| 0.7791666666666667 | 0 |
| 0.779861111111111 | 0 |
| 0.7805555555555556 | 0 |
| 0.78125 | 0 |
| 0.7819444444444444 | 0 |
| 0.782638888888889 | 0 |
| 0.7833333333333333 | 0 |
| 0.7840277777777778 | 0 |
| 0.7847222222222222 | 0 |
| 0.7854166666666668 | 0 |
| 0.7861111111111111 | 0 |
| 0.7868055555555555 | 0 |
| 0.7875 | 0 |
| 0.7881944444444445 | 0 |
| 0.7888888888888889 | 0 |
| 0.7895833333333333 | 0 |
| 0.7902777777777777 | 0 |
| 0.7909722222222223 | 0 |
| 0.7916666666666666 | 0 |
| 0.7923611111111111 | 0 |
| 0.7930555555555556 | 0 |
| 0.7937500000000001 | 0 |
| 0.7944444444444444 | 0 |
| 0.7951388888888888 | 0 |
| 0.7958333333333334 | 0 |
| 0.7965277777777778 | 0 |
| 0.7972222222222222 | 0 |
| 0.7979166666666666 | 0 |
| 0.7986111111111112 | 0 |
| 0.7993055555555556 | 0 |
| 0.7999999999999999 | 0 |
| 0.8006944444444444 | 0 |
| 0.8013888888888889 | 0 |
| 0.8020833333333334 | 0 |
| 0.8027777777777777 | 0 |
| 0.8034722222222223 | 0 |
| 0.8041666666666667 | 0 |
| 0.8048611111111111 | 0 |
| 0.8055555555555555 | 0 |
| 0.80625 | 0 |
| 0.8069444444444445 | 0 |
| 0.8076388888888889 | 0 |
| 0.8083333333333332 | 0 |
| 0.8090277777777778 | 0 |
| 0.8097222222222222 | 0 |
| 0.8104166666666667 | 0 |
| 0.811111111111111 | 0 |
| 0.8118055555555556 | 0 |
| 0.8125 | 0 |
| 0.8131944444444444 | 0 |
| 0.813888888888889 | 0 |
| 0.8145833333333333 | 0 |
| 0.8152777777777778 | 0 |
| 0.8159722222222222 | 0 |
| 0.8166666666666668 | 0 |
| 0.8173611111111111 | 0 |
| 0.8180555555555555 | 0 |
| 0.81875 | 0 |
| 0.8194444444444445 | 0 |
| 0.8201388888888889 | 0 |
| 0.8208333333333333 | 0 |
| 0.8215277777777777 | 0 |
| 0.8222222222222223 | 0 |
| 0.8229166666666666 | 0 |
| 0.8236111111111111 | 0 |
| 0.8243055555555556 | 0 |
| 0.8250000000000001 | 0 |
| 0.8256944444444444 | 0 |
| 0.8263888888888888 | 0 |
| 0.8270833333333334 | 0 |
| 0.8277777777777778 | 0 |
| 0.8284722222222222 | 0 |
| 0.8291666666666666 | 0 |
| 0.8298611111111112 | 0 |
| 0.8305555555555556 | 0 |
| 0.8312499999999999 | 0 |
| 0.8319444444444444 | 0 |
| 0.8326388888888889 | 0 |
| 0.8333333333333334 | 0 |
| 0.8340277777777777 | 0 |
| 0.8347222222222223 | 0 |
| 0.8354166666666667 | 0 |
| 0.8361111111111111 | 0 |
| 0.8368055555555555 | 0 |
| 0.8375 | 0 |
| 0.8381944444444445 | 0 |
| 0.8388888888888889 | 0 |
| 0.8395833333333332 | 0 |
| 0.8402777777777778 | 0 |
| 0.8409722222222222 | 0 |
| 0.8416666666666667 | 0 |
| 0.842361111111111 | 0 |
| 0.8430555555555556 | 0 |
| 0.84375 | 0 |
| 0.8444444444444444 | 0 |
| 0.845138888888889 | 0 |
| 0.8458333333333333 | 0 |
| 0.8465277777777778 | 0 |
| 0.8472222222222222 | 0 |
| 0.8479166666666668 | 0 |
| 0.8486111111111111 | 0 |
| 0.8493055555555555 | 0 |
| 0.85 | 0 |
| 0.8506944444444445 | 0 |
| 0.8513888888888889 | 0 |
| 0.8520833333333333 | 0 |
| 0.8527777777777777 | 0 |
| 0.8534722222222223 | 0 |
| 0.8541666666666666 | 0 |
| 0.8548611111111111 | 0 |
| 0.8555555555555556 | 0 |
| 0.8562500000000001 | 0 |
| 0.8569444444444444 | 0 |
| 0.8576388888888888 | 0 |
| 0.8583333333333334 | 0 |
| 0.8590277777777778 | 0 |
| 0.8597222222222222 | 0 |
| 0.8604166666666666 | 0 |
| 0.8611111111111112 | 0 |
| 0.8618055555555556 | 0 |
| 0.8624999999999999 | 0 |
| 0.8631944444444444 | 0 |
| 0.8638888888888889 | 0 |
| 0.8645833333333334 | 0 |
| 0.8652777777777777 | 0 |
| 0.8659722222222223 | 0 |
| 0.8666666666666667 | 0 |
| 0.8673611111111111 | 0 |
| 0.8680555555555555 | 0 |
| 0.86875 | 0 |
| 0.8694444444444445 | 0 |
| 0.8701388888888889 | 0 |
| 0.8708333333333332 | 0 |
| 0.8715277777777778 | 0 |
| 0.8722222222222222 | 0 |
| 0.8729166666666667 | 0 |
| 0.873611111111111 | 0 |
| 0.8743055555555556 | 0 |
| 0.875 | 0 |
| 0.8756944444444444 | 0 |
| 0.876388888888889 | 0 |
| 0.8770833333333333 | 0 |
| 0.8777777777777778 | 0 |
| 0.8784722222222222 | 0 |
| 0.8791666666666668 | 0 |
| 0.8798611111111111 | 0 |
| 0.8805555555555555 | 0 |
| 0.88125 | 0 |
| 0.8819444444444445 | 0 |
| 0.8826388888888889 | 0 |
| 0.8833333333333333 | 0 |
| 0.8840277777777777 | 0 |
| 0.8847222222222223 | 0 |
| 0.8854166666666666 | 0 |
| 0.8861111111111111 | 0 |
| 0.8868055555555556 | 0 |
| 0.8875000000000001 | 0 |
| 0.8881944444444444 | 0 |
| 0.8888888888888888 | 0 |
| 0.8895833333333334 | 0 |
| 0.8902777777777778 | 0 |
| 0.8909722222222222 | 0 |
| 0.8916666666666666 | 0 |
| 0.8923611111111112 | 0 |
| 0.8930555555555556 | 0 |
| 0.8937499999999999 | 0 |
| 0.8944444444444444 | 0 |
| 0.8951388888888889 | 0 |
| 0.8958333333333334 | 0 |
| 0.8965277777777777 | 0 |
| 0.8972222222222223 | 0 |
| 0.8979166666666667 | 0 |
| 0.8986111111111111 | 0 |
| 0.8993055555555555 | 0 |
| 0.9 | 0 |
| 0.9006944444444445 | 0 |
| 0.9013888888888889 | 0 |
| 0.9020833333333332 | 0 |
| 0.9027777777777778 | 0 |
| 0.9034722222222222 | 0 |
| 0.9041666666666667 | 0 |
| 0.904861111111111 | 0 |
| 0.9055555555555556 | 0 |
| 0.90625 | 0 |
| 0.9069444444444444 | 0 |
| 0.907638888888889 | 0 |
| 0.9083333333333333 | 0 |
| 0.9090277777777778 | 0 |
| 0.9097222222222222 | 0 |
| 0.9104166666666668 | 0 |
| 0.9111111111111111 | 0 |
| 0.9118055555555555 | 0 |
| 0.9125 | 0 |
| 0.9131944444444445 | 0 |
| 0.9138888888888889 | 0 |
| 0.9145833333333333 | 0 |
| 0.9152777777777777 | 0 |
| 0.9159722222222223 | 0 |
| 0.9166666666666666 | 0 |
| 0.9173611111111111 | 0 |
| 0.9180555555555556 | 0 |
| 0.9187500000000001 | 0 |
| 0.9194444444444444 | 0 |
| 0.9201388888888888 | 0 |
| 0.9208333333333334 | 0 |
| 0.9215277777777778 | 0 |
| 0.9222222222222222 | 0 |
| 0.9229166666666666 | 0 |
| 0.9236111111111112 | 0 |
| 0.9243055555555556 | 0 |
| 0.9249999999999999 | 0 |
| 0.9256944444444444 | 0 |
| 0.9263888888888889 | 0 |
| 0.9270833333333334 | 0 |
| 0.9277777777777777 | 0 |
| 0.9284722222222223 | 0 |
| 0.9291666666666667 | 0 |
| 0.9298611111111111 | 0 |
| 0.9305555555555555 | 0 |
| 0.93125 | 0 |
| 0.9319444444444445 | 0 |
| 0.9326388888888889 | 0 |
| 0.9333333333333332 | 0 |
| 0.9340277777777778 | 0 |
| 0.9347222222222222 | 0 |
| 0.9354166666666667 | 0 |
| 0.936111111111111 | 0 |
| 0.9368055555555556 | 0 |
| 0.9375 | 0 |
| 0.9381944444444444 | 0 |
| 0.938888888888889 | 0 |
| 0.9395833333333333 | 0 |
| 0.9402777777777778 | 0 |
| 0.9409722222222222 | 0 |
| 0.9416666666666668 | 0 |
| 0.9423611111111111 | 0 |
| 0.9430555555555555 | 0 |
| 0.94375 | 0 |
| 0.9444444444444445 | 0 |
| 0.9451388888888889 | 0 |
| 0.9458333333333333 | 0 |
| 0.9465277777777777 | 0 |
| 0.9472222222222223 | 0 |
| 0.9479166666666666 | 0 |
| 0.9486111111111111 | 0 |
| 0.9493055555555556 | 0 |
| 0.9500000000000001 | 0 |
| 0.9506944444444444 | 0 |
| 0.9513888888888888 | 0 |
| 0.9520833333333334 | 0 |
| 0.9527777777777778 | 0 |
| 0.9534722222222222 | 0 |
| 0.9541666666666666 | 0 |
| 0.9548611111111112 | 0 |
| 0.9555555555555556 | 0 |
| 0.9562499999999999 | 0 |
| 0.9569444444444444 | 0 |
| 0.9576388888888889 | 0 |
| 0.9583333333333334 | 0 |
| 0.9590277777777777 | 0 |
| 0.9597222222222223 | 0 |
| 0.9604166666666667 | 0 |
| 0.9611111111111111 | 0 |
| 0.9618055555555555 | 0 |
| 0.9625 | 0 |
| 0.9631944444444445 | 0 |
| 0.9638888888888889 | 0 |
| 0.9645833333333332 | 0 |
| 0.9652777777777778 | 0 |
| 0.9659722222222222 | 0 |
| 0.9666666666666667 | 0 |
| 0.967361111111111 | 0 |
| 0.9680555555555556 | 0 |
| 0.96875 | 0 |
| 0.9694444444444444 | 0 |
| 0.970138888888889 | 0 |
| 0.9708333333333333 | 0 |
| 0.9715277777777778 | 0 |
| 0.9722222222222222 | 0 |
| 0.9729166666666668 | 0 |
| 0.9736111111111111 | 0 |
| 0.9743055555555555 | 0 |
| 0.975 | 0 |
| 0.9756944444444445 | 0 |
| 0.9763888888888889 | 0 |
| 0.9770833333333333 | 0 |
| 0.9777777777777777 | 0 |
| 0.9784722222222223 | 0 |
| 0.9791666666666666 | 0 |
| 0.9798611111111111 | 0 |
| 0.9805555555555556 | 0 |
| 0.9812500000000001 | 0 |
| 0.9819444444444444 | 0 |
| 0.9826388888888888 | 0 |
| 0.9833333333333334 | 0 |
| 0.9840277777777778 | 0 |
| 0.9847222222222222 | 0 |
| 0.9854166666666666 | 0 |
| 0.9861111111111112 | 0 |
| 0.9868055555555556 | 0 |
| 0.9874999999999999 | 0 |
| 0.9881944444444444 | 0 |
| 0.9888888888888889 | 0 |
| 0.9895833333333334 | 0 |
| 0.9902777777777777 | 0 |
| 0.9909722222222223 | 0 |
| 0.9916666666666667 | 0 |
| 0.9923611111111111 | 0 |
| 0.9930555555555555 | 0 |
| 0.99375 | 0 |
| 0.9944444444444445 | 0 |
| 0.9951388888888889 | 0 |
| 0.9958333333333332 | 0 |
| 0.9965277777777778 | 0 |
| 0.9972222222222222 | 0 |
| 0.9979166666666667 | 0 |
| 0.998611111111111 | 0 |
| 0.9993055555555556 | 0 |